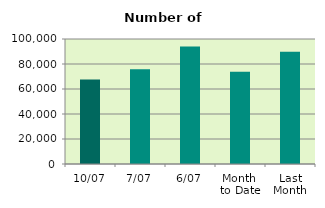
| Category | Series 0 |
|---|---|
| 10/07 | 67532 |
| 7/07 | 75858 |
| 6/07 | 94074 |
| Month 
to Date | 73750.333 |
| Last
Month | 89884.909 |